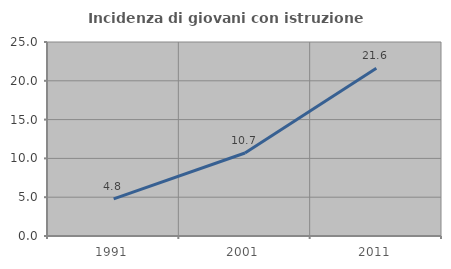
| Category | Incidenza di giovani con istruzione universitaria |
|---|---|
| 1991.0 | 4.795 |
| 2001.0 | 10.692 |
| 2011.0 | 21.622 |